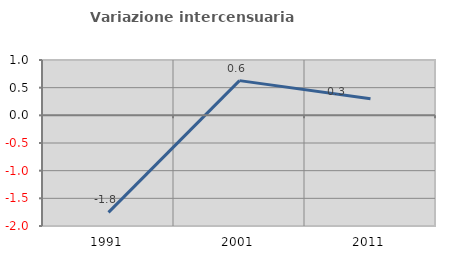
| Category | Variazione intercensuaria annua |
|---|---|
| 1991.0 | -1.754 |
| 2001.0 | 0.627 |
| 2011.0 | 0.299 |